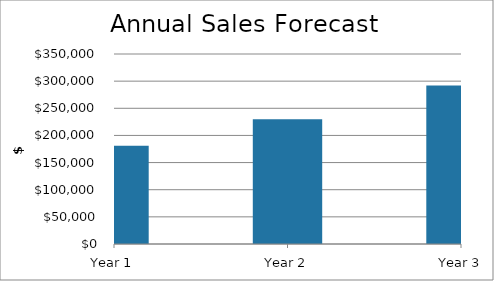
| Category | Total Sales |
|---|---|
| Year 1 | 181165.062 |
| Year 2 | 230031.557 |
| Year 3 | 292079.038 |